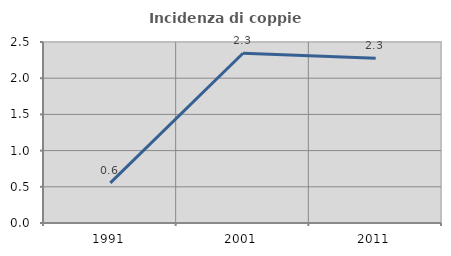
| Category | Incidenza di coppie miste |
|---|---|
| 1991.0 | 0.553 |
| 2001.0 | 2.345 |
| 2011.0 | 2.276 |